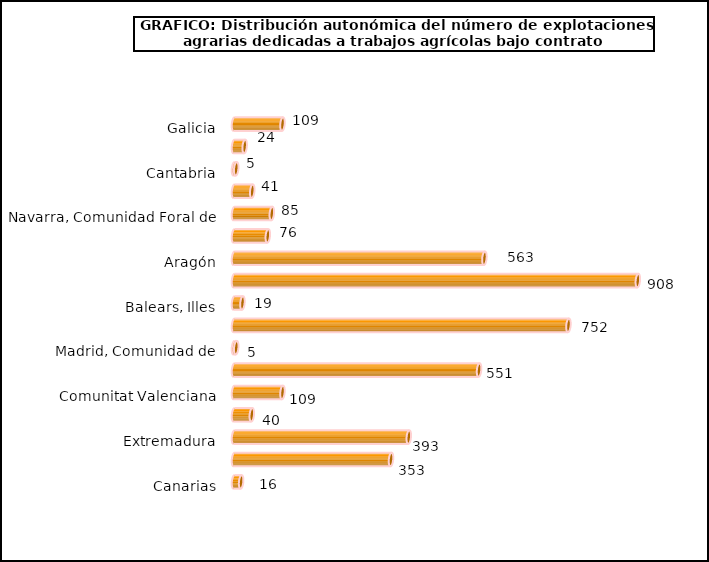
| Category | num. Explotaciones |
|---|---|
| Galicia | 109 |
| Asturias, Principado de | 24 |
| Cantabria | 5 |
| País Vasco | 41 |
| Navarra, Comunidad Foral de | 85 |
| Rioja, La | 76 |
| Aragón | 563 |
| Cataluña | 908 |
| Balears, Illes | 19 |
| Castilla y León | 752 |
| Madrid, Comunidad de | 5 |
| Castilla - La Mancha | 551 |
| Comunitat Valenciana | 109 |
| Murcia, Región de | 40 |
| Extremadura | 393 |
| Andalucía | 353 |
| Canarias | 16 |